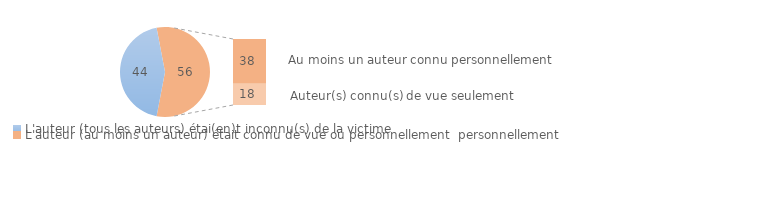
| Category | Series 0 |
|---|---|
| 0 | 44 |
| 1 | 0 |
| 2 | 38 |
| 3 | 18 |